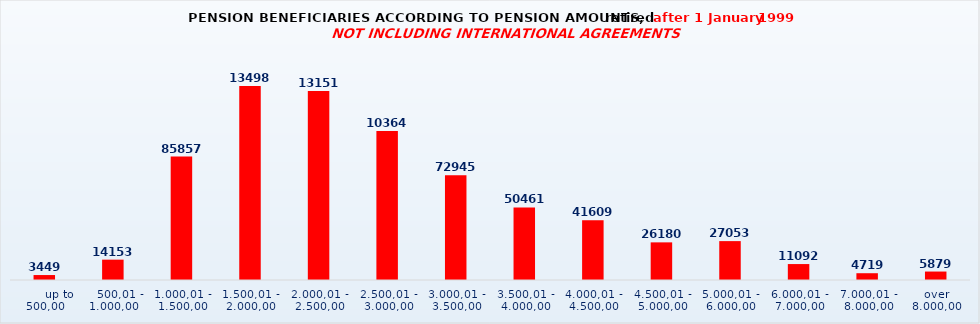
| Category | Series 0 |
|---|---|
|       up to 500,00 | 3449 |
|    500,01 - 1.000,00 | 14153 |
| 1.000,01 - 1.500,00 | 85857 |
| 1.500,01 - 2.000,00 | 134987 |
| 2.000,01 - 2.500,00 | 131517 |
| 2.500,01 - 3.000,00 | 103644 |
| 3.000,01 - 3.500,00 | 72945 |
| 3.500,01 - 4.000,00 | 50461 |
| 4.000,01 - 4.500,00 | 41609 |
| 4.500,01 - 5.000,00 | 26180 |
| 5.000,01 - 6.000,00 | 27053 |
| 6.000,01 - 7.000,00 | 11092 |
| 7.000,01 - 8.000,00 | 4719 |
| over 8.000,00 | 5879 |